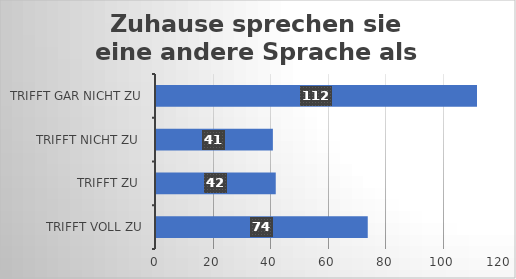
| Category | Zuhause sprechen sie eine andere Sprache als Deutsch. |
|---|---|
| trifft voll zu | 74 |
| trifft zu  | 42 |
| trifft nicht zu  | 41 |
| trifft gar nicht zu | 112 |